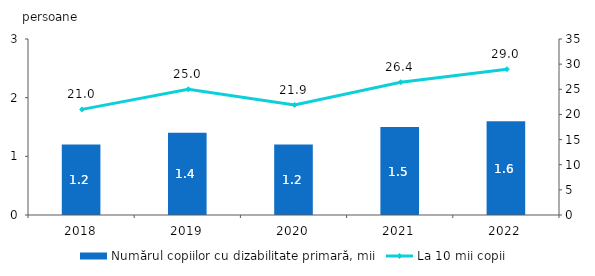
| Category | Numărul copiilor cu dizabilitate primară, mii |
|---|---|
| 2018.0 | 1.2 |
| 2019.0 | 1.4 |
| 2020.0 | 1.2 |
| 2021.0 | 1.5 |
| 2022.0 | 1.6 |